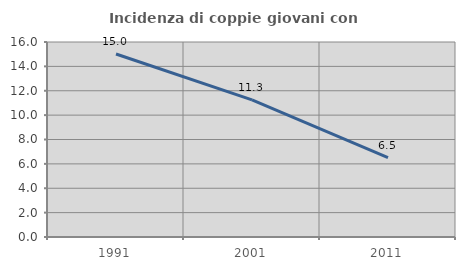
| Category | Incidenza di coppie giovani con figli |
|---|---|
| 1991.0 | 15.019 |
| 2001.0 | 11.251 |
| 2011.0 | 6.516 |